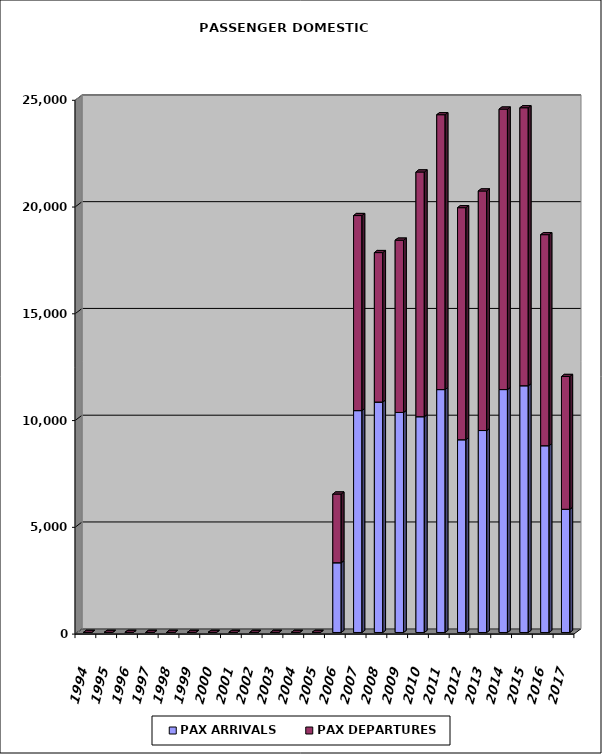
| Category | PAX ARRIVALS | PAX DEPARTURES |
|---|---|---|
| 1994.0 | 0 | 0 |
| 1995.0 | 0 | 0 |
| 1996.0 | 0 | 0 |
| 1997.0 | 0 | 0 |
| 1998.0 | 0 | 0 |
| 1999.0 | 0 | 0 |
| 2000.0 | 0 | 0 |
| 2001.0 | 0 | 0 |
| 2002.0 | 0 | 0 |
| 2003.0 | 0 | 0 |
| 2004.0 | 0 | 0 |
| 2005.0 | 0 | 0 |
| 2006.0 | 3267 | 3217 |
| 2007.0 | 10392 | 9134 |
| 2008.0 | 10793 | 6999 |
| 2009.0 | 10306 | 8067 |
| 2010.0 | 10107 | 11460 |
| 2011.0 | 11376 | 12873 |
| 2012.0 | 9028 | 10867 |
| 2013.0 | 9458 | 11219 |
| 2014.0 | 11377 | 13135 |
| 2015.0 | 11557 | 13018 |
| 2016.0 | 8748 | 9883 |
| 2017.0 | 5772 | 6217 |